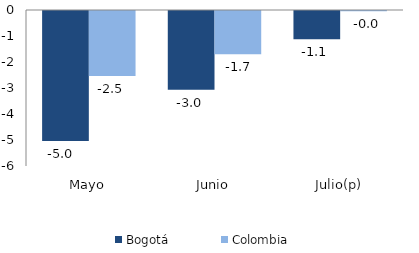
| Category | Bogotá | Colombia |
|---|---|---|
| Mayo | -4.999 | -2.502 |
| Junio | -3.024 | -1.66 |
| Julio(p) | -1.09 | -0.013 |